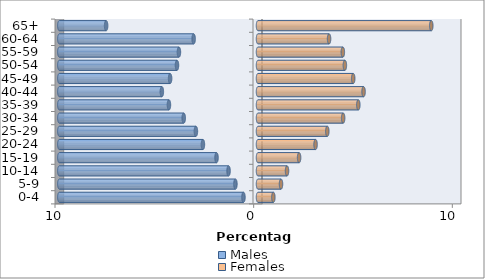
| Category | Males | Females |
|---|---|---|
| 0-4 | -0.732 | 0.773 |
| 5-9 | -1.136 | 1.158 |
| 10-14 | -1.482 | 1.461 |
| 15-19 | -2.088 | 2.069 |
| 20-24 | -2.773 | 2.897 |
| 25-29 | -3.126 | 3.489 |
| 30-34 | -3.739 | 4.286 |
| 35-39 | -4.483 | 5.05 |
| 40-44 | -4.84 | 5.314 |
| 45-49 | -4.424 | 4.793 |
| 50-54 | -4.078 | 4.373 |
| 55-59 | -3.98 | 4.271 |
| 60-64 | -3.24 | 3.577 |
| 65+ | -7.645 | 8.722 |